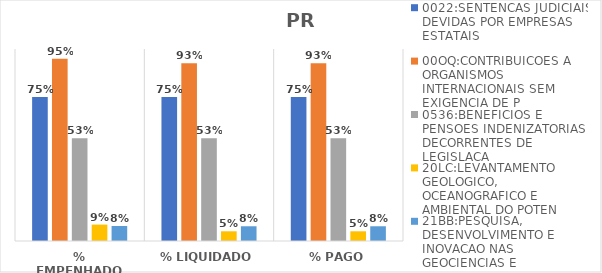
| Category | 0022:SENTENCAS JUDICIAIS DEVIDAS POR EMPRESAS ESTATAIS | 00OQ:CONTRIBUICOES A ORGANISMOS INTERNACIONAIS SEM EXIGENCIA DE P | 0536:BENEFICIOS E PENSOES INDENIZATORIAS DECORRENTES DE LEGISLACA | 20LC:LEVANTAMENTO GEOLOGICO, OCEANOGRAFICO E AMBIENTAL DO POTEN | 21BB:PESQUISA, DESENVOLVIMENTO E INOVACAO NAS GEOCIENCIAS E |
|---|---|---|---|---|---|
| % EMPENHADO | 0.751 | 0.95 | 0.535 | 0.085 | 0.078 |
| % LIQUIDADO | 0.751 | 0.926 | 0.535 | 0.051 | 0.077 |
| % PAGO | 0.751 | 0.926 | 0.535 | 0.051 | 0.077 |